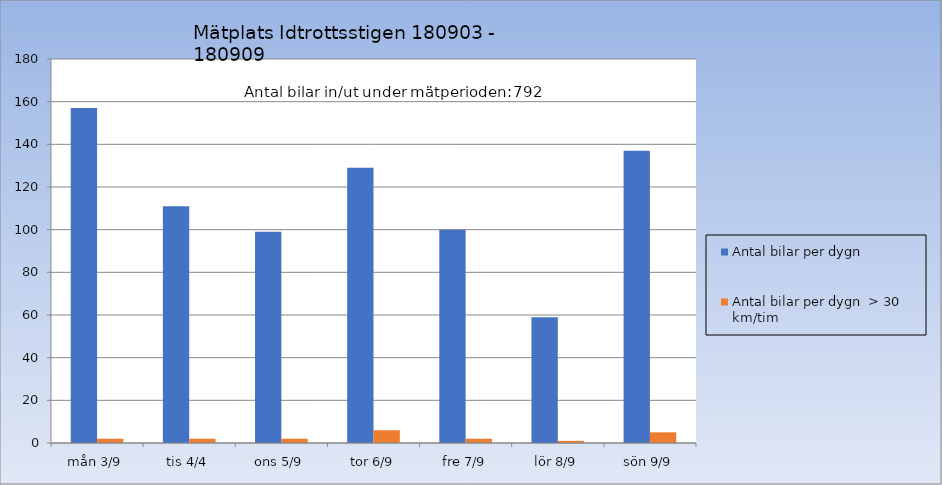
| Category | Antal bilar per dygn | Antal bilar per dygn  > 30 km/tim |
|---|---|---|
| mån 3/9 | 157 | 2 |
| tis 4/4 | 111 | 2 |
| ons 5/9 | 99 | 2 |
| tor 6/9 | 129 | 6 |
| fre 7/9 | 100 | 2 |
| lör 8/9 | 59 | 1 |
| sön 9/9 | 137 | 5 |